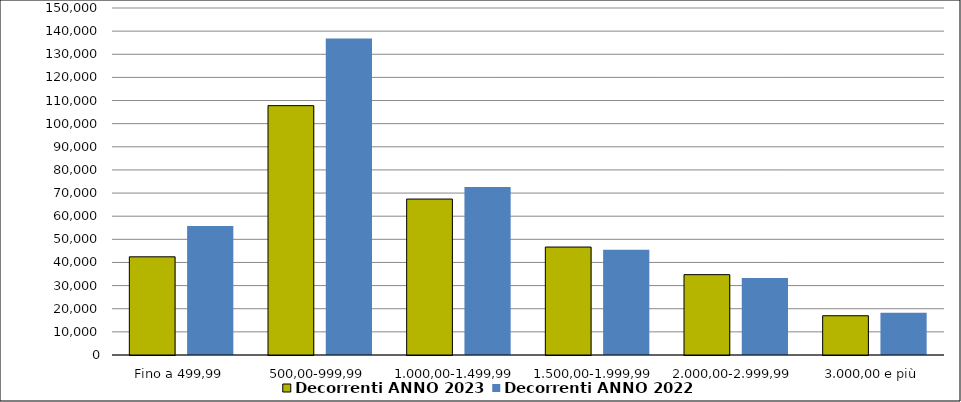
| Category | Decorrenti ANNO 2023 | Decorrenti ANNO 2022 |
|---|---|---|
|  Fino a 499,99  | 42440 | 55796 |
|  500,00-999,99  | 107789 | 136770 |
|  1.000,00-1.499,99  | 67411 | 72606 |
|  1.500,00-1.999,99  | 46659 | 45477 |
|  2.000,00-2.999,99  | 34731 | 33311 |
|  3.000,00 e più  | 16971 | 18302 |